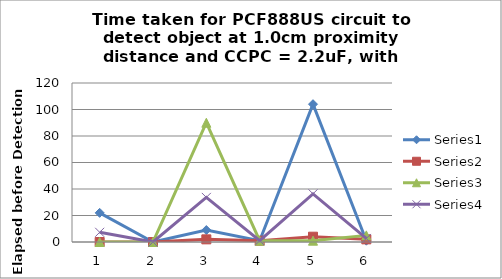
| Category | Series 0 | Series 1 | Series 2 | Series 3 |
|---|---|---|---|---|
| 0 | 22 | 0 | 0 | 7.333 |
| 1 | 0 | 0 | 0 | 0 |
| 2 | 9 | 2 | 90 | 33.667 |
| 3 | 1 | 1 | 1 | 1 |
| 4 | 104 | 4 | 1 | 36.333 |
| 5 | 1 | 2 | 5 | 2.667 |